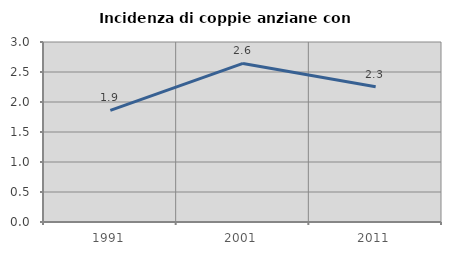
| Category | Incidenza di coppie anziane con figli |
|---|---|
| 1991.0 | 1.86 |
| 2001.0 | 2.643 |
| 2011.0 | 2.255 |